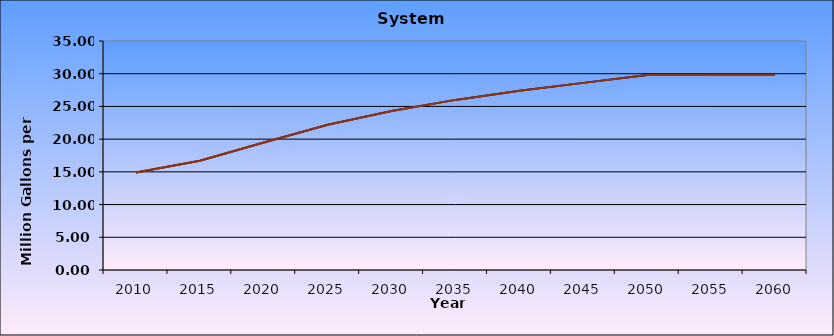
| Category | Series 0 | Series 1 |
|---|---|---|
| 2010.0 | 14.9 | 14.9 |
| 2015.0 | 16.7 | 16.7 |
| 2020.0 | 19.5 | 19.5 |
| 2025.0 | 22.2 | 22.2 |
| 2030.0 | 24.3 | 24.3 |
| 2035.0 | 26 | 26 |
| 2040.0 | 27.4 | 27.4 |
| 2045.0 | 28.6 | 28.6 |
| 2050.0 | 29.8 | 29.8 |
| 2055.0 | 29.8 | 29.8 |
| 2060.0 | 29.8 | 29.8 |